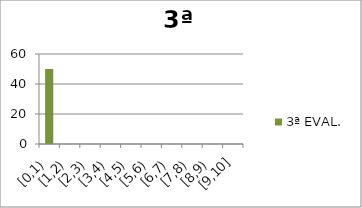
| Category | 3ª EVAL. |
|---|---|
| [0,1) | 50 |
| [1,2) | 0 |
| [2,3) | 0 |
| [3,4) | 0 |
| [4,5) | 0 |
| [5,6) | 0 |
| [6,7) | 0 |
| [7,8) | 0 |
| [8,9) | 0 |
| [9,10] | 0 |